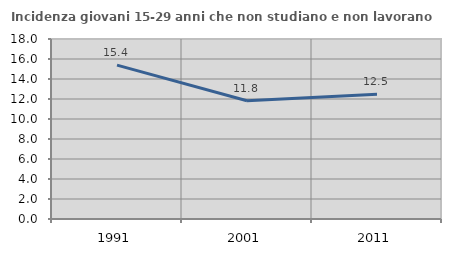
| Category | Incidenza giovani 15-29 anni che non studiano e non lavorano  |
|---|---|
| 1991.0 | 15.385 |
| 2001.0 | 11.825 |
| 2011.0 | 12.468 |